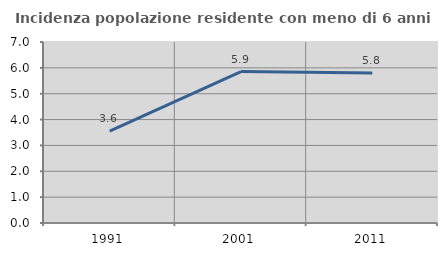
| Category | Incidenza popolazione residente con meno di 6 anni |
|---|---|
| 1991.0 | 3.555 |
| 2001.0 | 5.855 |
| 2011.0 | 5.797 |